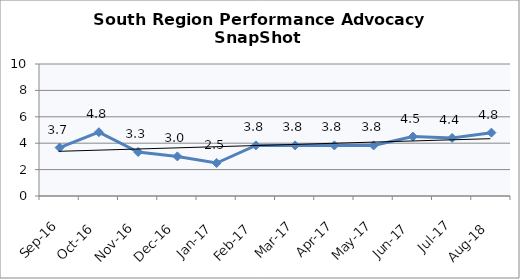
| Category | South Region |
|---|---|
| Sep-16 | 3.667 |
| Oct-16 | 4.833 |
| Nov-16 | 3.333 |
| Dec-16 | 3 |
| Jan-17 | 2.5 |
| Feb-17 | 3.833 |
| Mar-17 | 3.833 |
| Apr-17 | 3.833 |
| May-17 | 3.833 |
| Jun-17 | 4.5 |
| Jul-17 | 4.4 |
| Aug-18 | 4.8 |